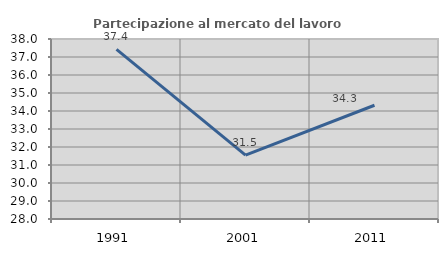
| Category | Partecipazione al mercato del lavoro  femminile |
|---|---|
| 1991.0 | 37.423 |
| 2001.0 | 31.548 |
| 2011.0 | 34.32 |